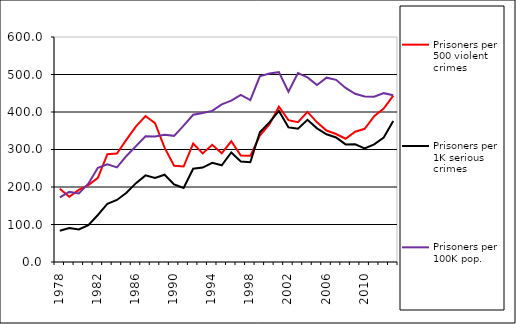
| Category | Prisoners per 500 violent crimes | Prisoners per 1K serious crimes | Prisoners per 100K pop. |
|---|---|---|---|
| 1978.0 | 195.601 | 83.506 | 172.384 |
| 1979.0 | 173.969 | 90.538 | 186.942 |
| 1980.0 | 192.458 | 86.807 | 182.757 |
| 1981.0 | 204.993 | 98.493 | 208.696 |
| 1982.0 | 224.481 | 125.373 | 251.329 |
| 1983.0 | 287.509 | 155.413 | 260.561 |
| 1984.0 | 289.405 | 165.365 | 252.202 |
| 1985.0 | 326.345 | 184.75 | 282.797 |
| 1986.0 | 361.82 | 210.3 | 309.005 |
| 1987.0 | 389.149 | 231.008 | 335.248 |
| 1988.0 | 370.178 | 224.084 | 334.394 |
| 1989.0 | 304.94 | 232.658 | 339.376 |
| 1990.0 | 256.701 | 206.925 | 336.402 |
| 1991.0 | 254.581 | 197.445 | 363.676 |
| 1992.0 | 316.005 | 248.667 | 392.598 |
| 1993.0 | 289.627 | 251.788 | 397.286 |
| 1994.0 | 312.596 | 264.632 | 402.833 |
| 1995.0 | 289.919 | 257.849 | 420.363 |
| 1996.0 | 321.878 | 292.178 | 430.207 |
| 1997.0 | 283.678 | 268.112 | 445.902 |
| 1998.0 | 283.057 | 266.098 | 431.586 |
| 1999.0 | 337.008 | 346.043 | 494.998 |
| 2000.0 | 367.052 | 372.152 | 502.425 |
| 2001.0 | 414.236 | 402.817 | 506.277 |
| 2002.0 | 378.309 | 359.042 | 454.001 |
| 2003.0 | 373.032 | 355.621 | 503.81 |
| 2004.0 | 400.294 | 379.339 | 492.369 |
| 2005.0 | 372.468 | 356.457 | 471.879 |
| 2006.0 | 350.577 | 340.503 | 491.519 |
| 2007.0 | 341.378 | 332.121 | 485.797 |
| 2008.0 | 328.673 | 313.57 | 464.158 |
| 2009.0 | 347.541 | 313.764 | 448.639 |
| 2010.0 | 355.247 | 302.597 | 441.124 |
| 2011.0 | 389.094 | 313.69 | 440.793 |
| 2012.0 | 408.974 | 331.993 | 450.247 |
| 2013.0 | 443.773 | 376.143 | 444.425 |